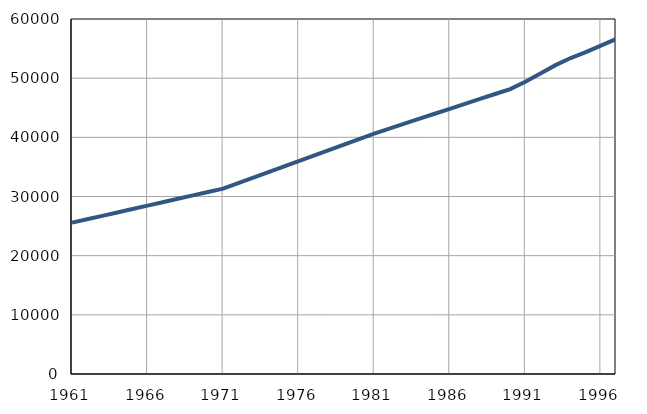
| Category | Број
становника |
|---|---|
| 1961.0 | 25582 |
| 1962.0 | 26157 |
| 1963.0 | 26732 |
| 1964.0 | 27307 |
| 1965.0 | 27882 |
| 1966.0 | 28457 |
| 1967.0 | 29032 |
| 1968.0 | 29607 |
| 1969.0 | 30182 |
| 1970.0 | 30757 |
| 1971.0 | 31335 |
| 1972.0 | 32266 |
| 1973.0 | 33197 |
| 1974.0 | 34128 |
| 1975.0 | 35059 |
| 1976.0 | 35990 |
| 1977.0 | 36921 |
| 1978.0 | 37852 |
| 1979.0 | 38783 |
| 1980.0 | 39714 |
| 1981.0 | 40640 |
| 1982.0 | 41476 |
| 1983.0 | 42312 |
| 1984.0 | 43148 |
| 1985.0 | 43984 |
| 1986.0 | 44820 |
| 1987.0 | 45656 |
| 1988.0 | 46492 |
| 1989.0 | 47328 |
| 1990.0 | 48164 |
| 1991.0 | 49400 |
| 1992.0 | 50800 |
| 1993.0 | 52200 |
| 1994.0 | 53400 |
| 1995.0 | 54400 |
| 1996.0 | 55500 |
| 1997.0 | 56600 |